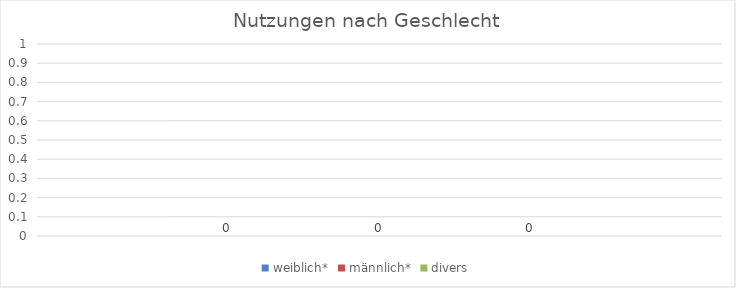
| Category | weiblich* | männlich* | divers |
|---|---|---|---|
| 0 | 0 | 0 | 0 |